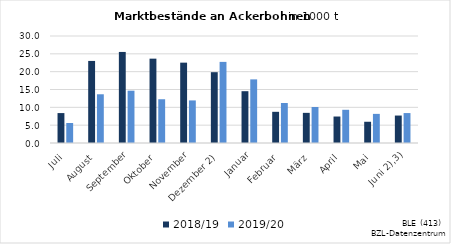
| Category | 2018/19 | 2019/20 |
|---|---|---|
| Juli | 8.39 | 5.609 |
| August | 23.009 | 13.662 |
| September | 25.53 | 14.666 |
| Oktober | 23.649 | 12.267 |
| November | 22.528 | 11.939 |
|  Dezember 2) | 19.855 | 22.742 |
| Januar | 14.525 | 17.837 |
| Februar | 8.744 | 11.21 |
| März | 8.452 | 10.091 |
| April | 7.424 | 9.312 |
| Mai | 5.955 | 8.166 |
|    Juni 2),3) | 7.697 | 8.393 |